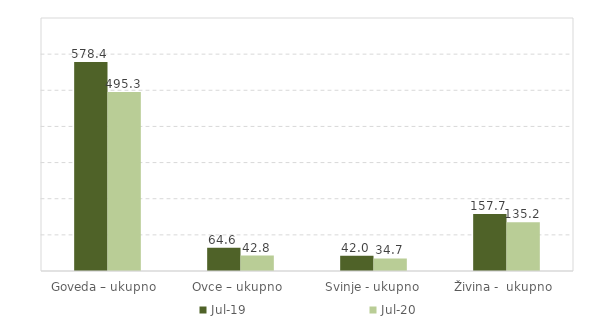
| Category | Jul-19 | Jul-20 |
|---|---|---|
| Goveda – ukupno  | 578.4 | 495.3 |
| Ovce – ukupno  | 64.6 | 42.8 |
| Svinje - ukupno | 42 | 34.7 |
| Živina -  ukupno  | 157.7 | 135.2 |